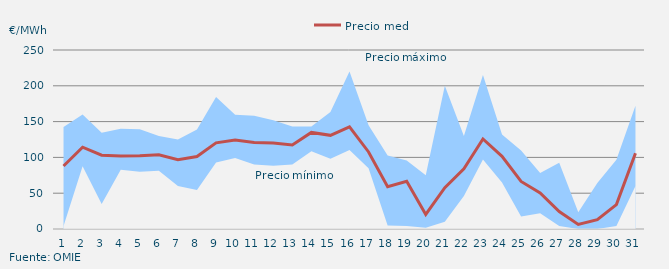
| Category | Precio medio |
|---|---|
| 1.0 | 88.053 |
| 2.0 | 114.221 |
| 3.0 | 103.017 |
| 4.0 | 101.955 |
| 5.0 | 102.333 |
| 6.0 | 103.789 |
| 7.0 | 96.814 |
| 8.0 | 101.172 |
| 9.0 | 120.341 |
| 10.0 | 124.193 |
| 11.0 | 120.884 |
| 12.0 | 120.039 |
| 13.0 | 117.335 |
| 14.0 | 134.863 |
| 15.0 | 130.811 |
| 16.0 | 142.639 |
| 17.0 | 107.6 |
| 18.0 | 59.125 |
| 19.0 | 66.729 |
| 20.0 | 20.346 |
| 21.0 | 57.638 |
| 22.0 | 84.219 |
| 23.0 | 125.731 |
| 24.0 | 101.508 |
| 25.0 | 66.366 |
| 26.0 | 50.347 |
| 27.0 | 24.467 |
| 28.0 | 6.353 |
| 29.0 | 13.068 |
| 30.0 | 34.125 |
| 31.0 | 105.859 |